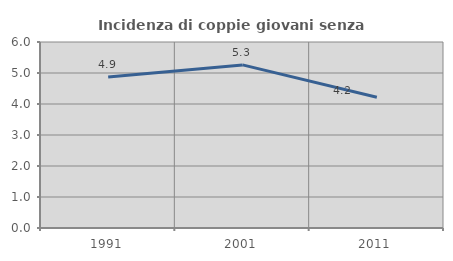
| Category | Incidenza di coppie giovani senza figli |
|---|---|
| 1991.0 | 4.874 |
| 2001.0 | 5.262 |
| 2011.0 | 4.22 |